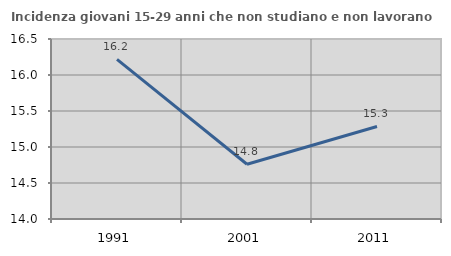
| Category | Incidenza giovani 15-29 anni che non studiano e non lavorano  |
|---|---|
| 1991.0 | 16.216 |
| 2001.0 | 14.761 |
| 2011.0 | 15.285 |